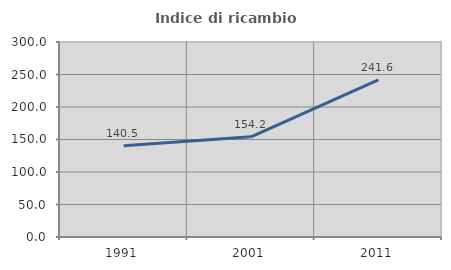
| Category | Indice di ricambio occupazionale  |
|---|---|
| 1991.0 | 140.476 |
| 2001.0 | 154.206 |
| 2011.0 | 241.627 |